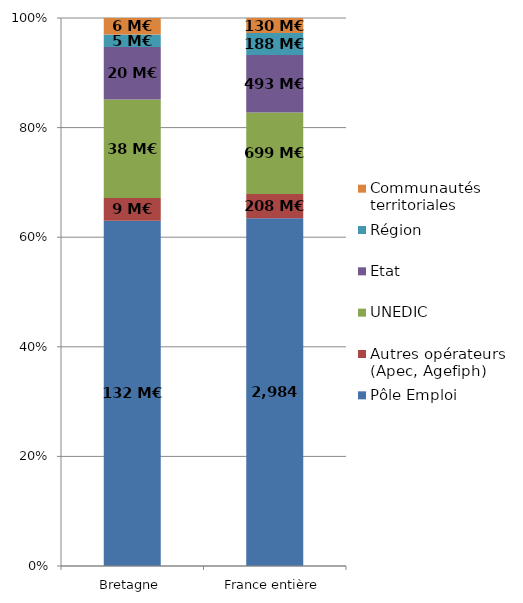
| Category | Pôle Emploi | Autres opérateurs (Apec, Agefiph) | UNEDIC | Etat | Région | Communautés territoriales |
|---|---|---|---|---|---|---|
| Bretagne | 132.325 | 8.793 | 37.696 | 20.14 | 4.814 | 6.306 |
| France entière | 2983.694 | 207.577 | 699.479 | 493.308 | 188.079 | 129.71 |